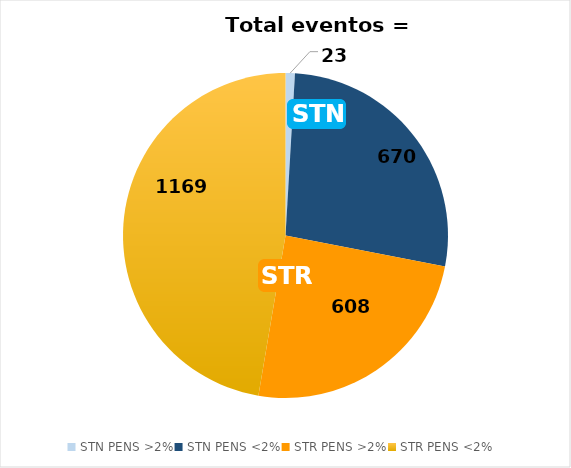
| Category | eventos |
|---|---|
| STN PENS >2% | 23 |
| STN PENS <2% | 670 |
| STR PENS >2% | 608 |
| STR PENS <2% | 1169 |